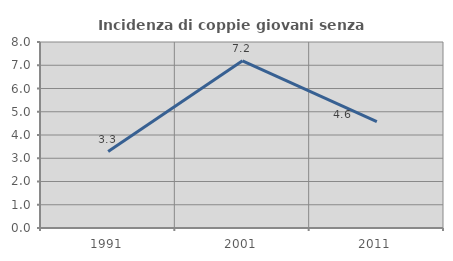
| Category | Incidenza di coppie giovani senza figli |
|---|---|
| 1991.0 | 3.289 |
| 2001.0 | 7.19 |
| 2011.0 | 4.575 |